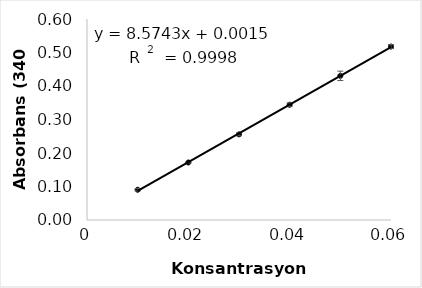
| Category | Series 0 |
|---|---|
| 0.01 | 0.09 |
| 0.02 | 0.172 |
| 0.03 | 0.256 |
| 0.04 | 0.344 |
| 0.05 | 0.43 |
| 0.06 | 0.518 |